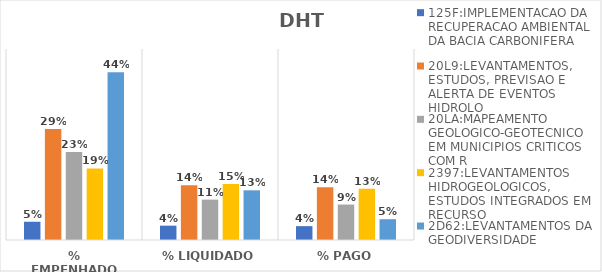
| Category | 125F:IMPLEMENTACAO DA RECUPERACAO AMBIENTAL DA BACIA CARBONIFERA | 20L9:LEVANTAMENTOS, ESTUDOS, PREVISAO E ALERTA DE EVENTOS HIDROLO | 20LA:MAPEAMENTO GEOLOGICO-GEOTECNICO EM MUNICIPIOS CRITICOS COM R | 2397:LEVANTAMENTOS HIDROGEOLOGICOS, ESTUDOS INTEGRADOS EM RECURSO | 2D62:LEVANTAMENTOS DA GEODIVERSIDADE |
|---|---|---|---|---|---|
| % EMPENHADO | 0.048 | 0.291 | 0.23 | 0.187 | 0.439 |
| % LIQUIDADO | 0.038 | 0.143 | 0.106 | 0.146 | 0.13 |
| % PAGO | 0.036 | 0.138 | 0.093 | 0.134 | 0.054 |